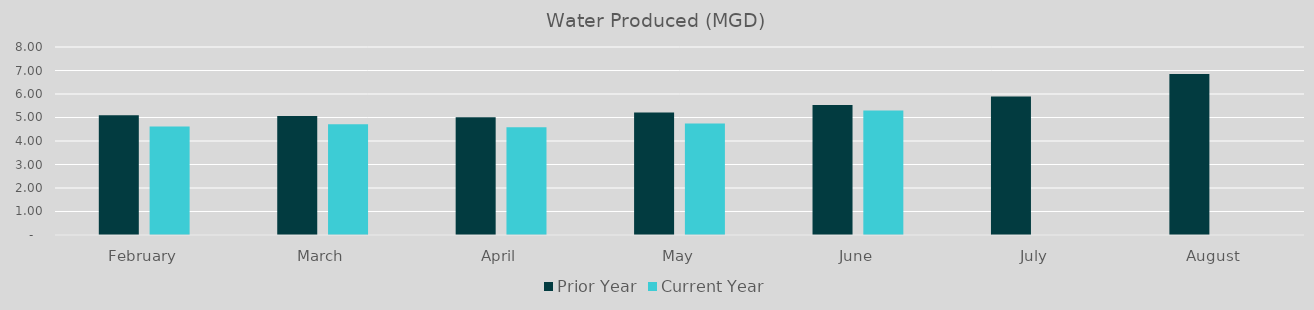
| Category | Prior Year | Current Year |
|---|---|---|
| February | 5.1 | 4.62 |
| March | 5.06 | 4.71 |
| April | 5.01 | 4.58 |
| May | 5.21 | 4.75 |
| June | 5.53 | 5.3 |
| July | 5.89 | 0 |
| August | 6.85 | 0 |